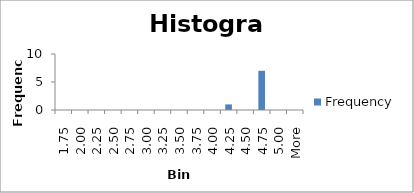
| Category | Frequency |
|---|---|
| 1.75 | 0 |
| 2.00 | 0 |
| 2.25 | 0 |
| 2.50 | 0 |
| 2.75 | 0 |
| 3.00 | 0 |
| 3.25 | 0 |
| 3.50 | 0 |
| 3.75 | 0 |
| 4.00 | 0 |
| 4.25 | 1 |
| 4.50 | 0 |
| 4.75 | 7 |
| 5.00 | 0 |
| More | 0 |